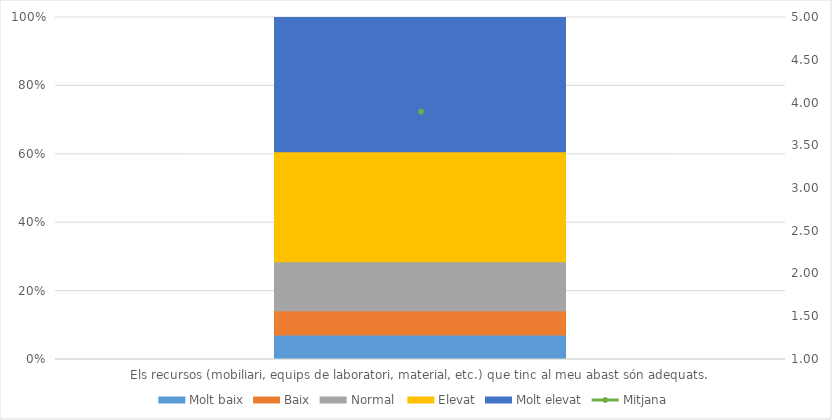
| Category | Molt baix | Baix | Normal  | Elevat | Molt elevat |
|---|---|---|---|---|---|
| Els recursos (mobiliari, equips de laboratori, material, etc.) que tinc al meu abast són adequats. | 2 | 2 | 4 | 9 | 11 |